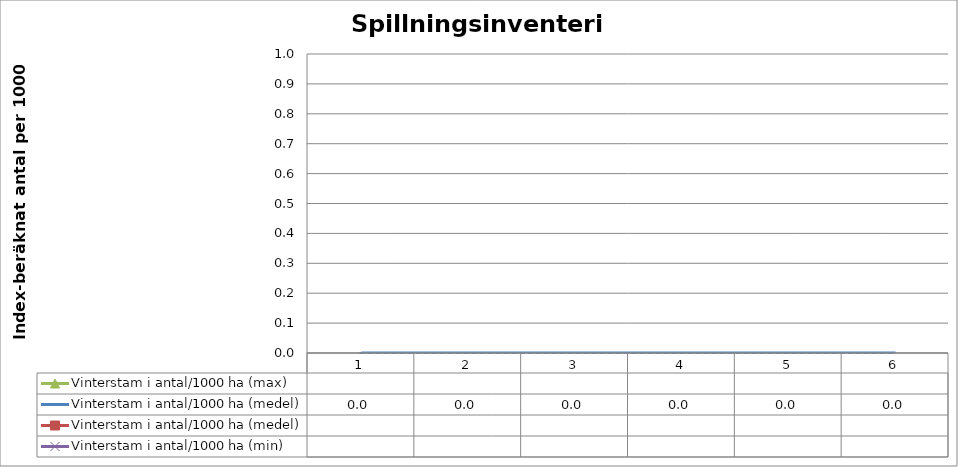
| Category | Vinterstam i antal/1000 ha (max) | Vinterstam i antal/1000 ha (medel) | Vinterstam i antal/1000 ha (min) |
|---|---|---|---|
| 0 |  |  |  |
| 1 |  |  |  |
| 2 |  |  |  |
| 3 |  |  |  |
| 4 |  |  |  |
| 5 |  |  |  |